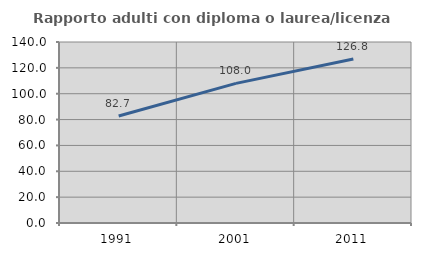
| Category | Rapporto adulti con diploma o laurea/licenza media  |
|---|---|
| 1991.0 | 82.745 |
| 2001.0 | 108.005 |
| 2011.0 | 126.81 |